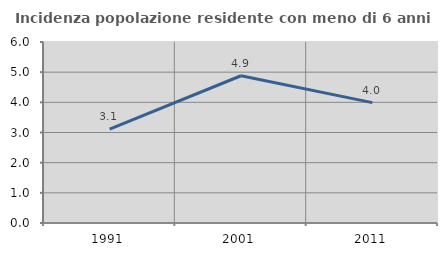
| Category | Incidenza popolazione residente con meno di 6 anni |
|---|---|
| 1991.0 | 3.11 |
| 2001.0 | 4.882 |
| 2011.0 | 3.991 |